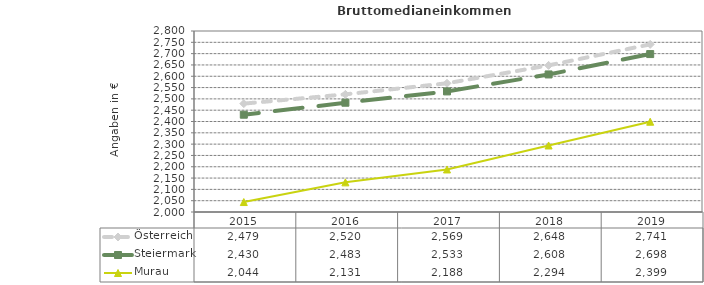
| Category | Österreich | Steiermark | Murau |
|---|---|---|---|
| 2019.0 | 2741 | 2698 | 2399 |
| 2018.0 | 2648 | 2608 | 2294 |
| 2017.0 | 2569 | 2533 | 2188 |
| 2016.0 | 2520 | 2483 | 2131 |
| 2015.0 | 2479 | 2430 | 2044 |